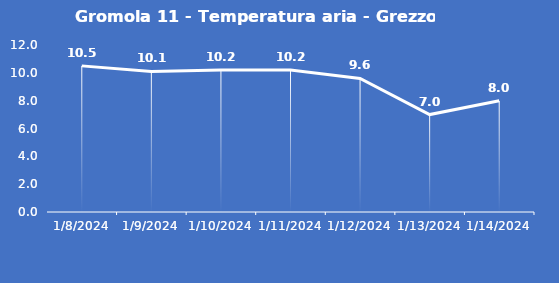
| Category | Gromola 11 - Temperatura aria - Grezzo (°C) |
|---|---|
| 1/8/24 | 10.5 |
| 1/9/24 | 10.1 |
| 1/10/24 | 10.2 |
| 1/11/24 | 10.2 |
| 1/12/24 | 9.6 |
| 1/13/24 | 7 |
| 1/14/24 | 8 |